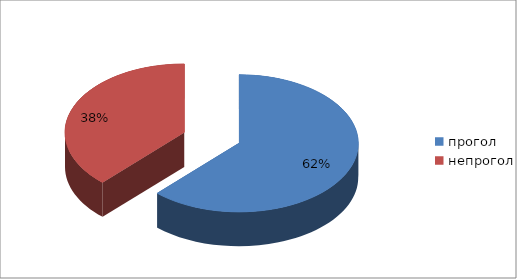
| Category | Series 0 |
|---|---|
| прогол | 31 |
| непрогол | 19 |